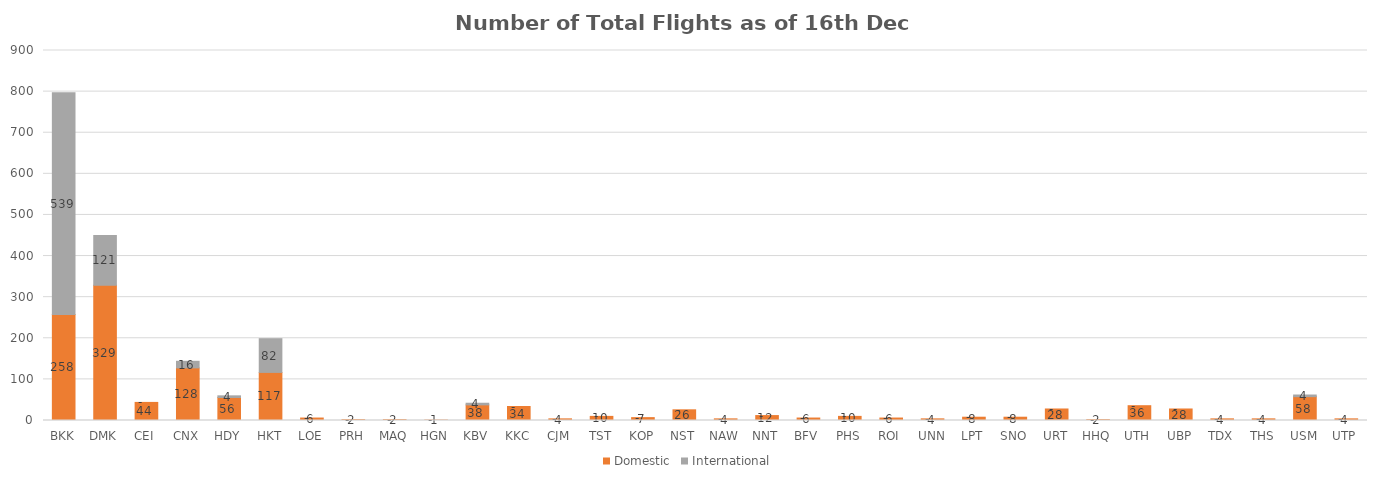
| Category | Domestic | International |
|---|---|---|
| BKK | 258 | 539 |
| DMK | 329 | 121 |
| CEI | 44 | 0 |
| CNX | 128 | 16 |
| HDY | 56 | 4 |
| HKT | 117 | 82 |
| LOE | 6 | 0 |
| PRH | 2 | 0 |
| MAQ | 2 | 0 |
| HGN | 1 | 0 |
| KBV | 38 | 4 |
| KKC | 34 | 0 |
| CJM | 4 | 0 |
| TST | 10 | 0 |
| KOP | 7 | 0 |
| NST | 26 | 0 |
| NAW | 4 | 0 |
| NNT | 12 | 0 |
| BFV | 6 | 0 |
| PHS | 10 | 0 |
| ROI | 6 | 0 |
| UNN | 4 | 0 |
| LPT | 8 | 0 |
| SNO | 8 | 0 |
| URT | 28 | 0 |
| HHQ | 2 | 0 |
| UTH | 36 | 0 |
| UBP | 28 | 0 |
| TDX | 4 | 0 |
| THS | 4 | 0 |
| USM | 58 | 4 |
| UTP | 4 | 0 |